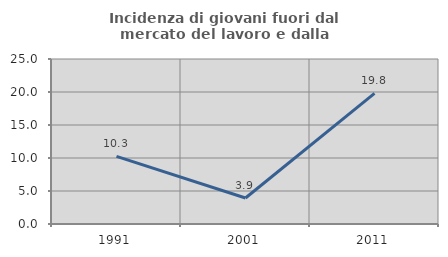
| Category | Incidenza di giovani fuori dal mercato del lavoro e dalla formazione  |
|---|---|
| 1991.0 | 10.256 |
| 2001.0 | 3.937 |
| 2011.0 | 19.78 |